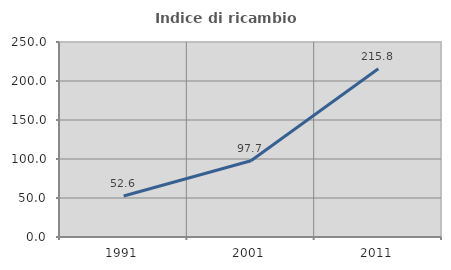
| Category | Indice di ricambio occupazionale  |
|---|---|
| 1991.0 | 52.56 |
| 2001.0 | 97.683 |
| 2011.0 | 215.775 |